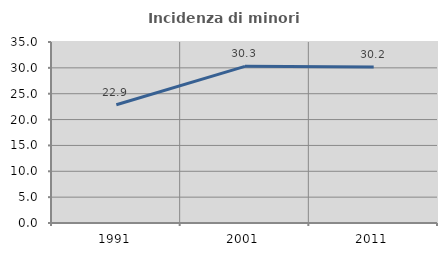
| Category | Incidenza di minori stranieri |
|---|---|
| 1991.0 | 22.857 |
| 2001.0 | 30.29 |
| 2011.0 | 30.171 |